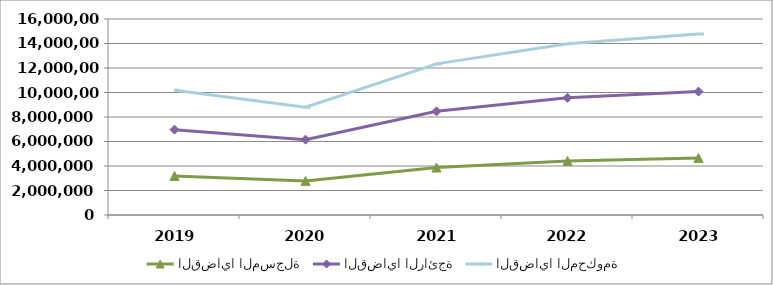
| Category | القضايا المسجلة | القضايا الرائجة | القضايا المحكومة |
|---|---|---|---|
| 2019.0 | 3182606 | 3785058 | 3221143 |
| 2020.0 | 2782048 | 3368901 | 2649452 |
| 2021.0 | 3873640 | 4590276 | 3875011 |
| 2022.0 | 4412765 | 5155041 | 4403226 |
| 2023.0 | 4658870 | 5417398 | 4697249 |